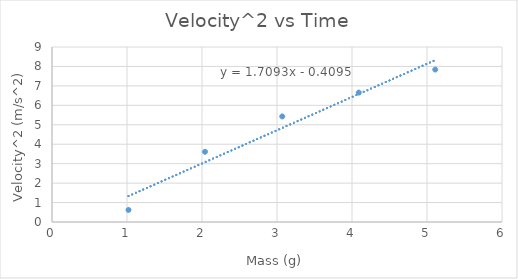
| Category | Series 0 |
|---|---|
| 1.02 | 0.621 |
| 2.04 | 3.61 |
| 3.07 | 5.429 |
| 4.09 | 6.656 |
| 5.11 | 7.84 |